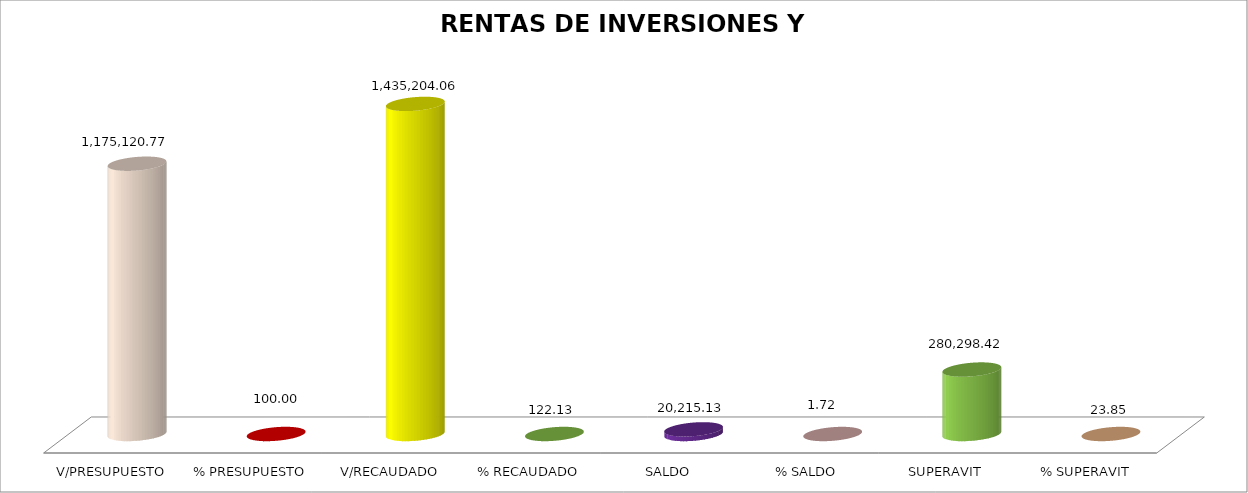
| Category | RENTAS DE INVERSIONES Y MULTAS |
|---|---|
| V/PRESUPUESTO | 1175120.77 |
| % PRESUPUESTO | 100 |
| V/RECAUDADO | 1435204.06 |
| % RECAUDADO | 122.132 |
| SALDO | 20215.13 |
| % SALDO | 1.72 |
| SUPERAVIT | 280298.42 |
| % SUPERAVIT | 23.853 |